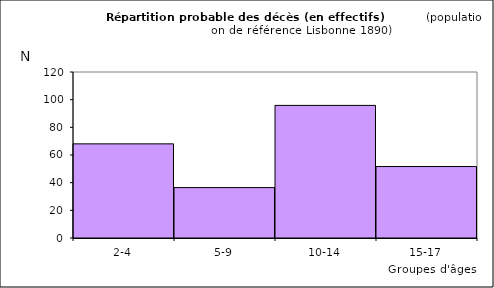
| Category | Series 0 |
|---|---|
| 2-4 | 68.045 |
| 5-9 | 36.431 |
| 10-14 | 95.862 |
| 15-17 | 51.662 |